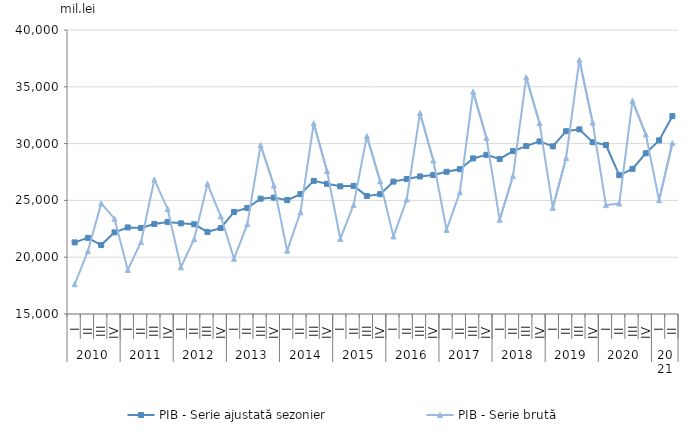
| Category | PIB - Serie ajustată sezonier | PIB - Serie brută |
|---|---|---|
| 0 | 21304.734 | 17618.538 |
| 1 | 21703.866 | 20535.088 |
| 2 | 21067.874 | 24733.989 |
| 3 | 22185.31 | 23387.763 |
| 4 | 22619.5 | 18878.295 |
| 5 | 22574.947 | 21341.813 |
| 6 | 22925.519 | 26828.484 |
| 7 | 23107.692 | 24246.43 |
| 8 | 22981.248 | 19113.189 |
| 9 | 22896.246 | 21579.683 |
| 10 | 22223.198 | 26464.253 |
| 11 | 22566.69 | 23599.498 |
| 12 | 23992.513 | 19867.239 |
| 13 | 24332.297 | 22910.429 |
| 14 | 25152.077 | 29875.092 |
| 15 | 25245.466 | 26311.771 |
| 16 | 25024.693 | 20575.18 |
| 17 | 25548.386 | 23951.428 |
| 18 | 26722.811 | 31790.125 |
| 19 | 26465.746 | 27595.654 |
| 20 | 26240.426 | 21618.259 |
| 21 | 26280.761 | 24596.839 |
| 22 | 25392.562 | 30659.04 |
| 23 | 25547.246 | 26686.781 |
| 24 | 26653.995 | 21830.624 |
| 25 | 26880.469 | 25078.445 |
| 26 | 27109.861 | 32689.956 |
| 27 | 27228.434 | 28527.778 |
| 28 | 27521.08 | 22398.641 |
| 29 | 27744.267 | 25719.356 |
| 30 | 28695.968 | 34566.719 |
| 31 | 29010.252 | 30514.091 |
| 32 | 28648.268 | 23292.847 |
| 33 | 29338.939 | 27146.722 |
| 34 | 29782.348 | 35830.318 |
| 35 | 30192.685 | 31798.143 |
| 36 | 29761.038 | 24344.903 |
| 37 | 31090.309 | 28735.64 |
| 38 | 31253.387 | 37368.572 |
| 39 | 30128.387 | 31846.321 |
| 40 | 29879.169 | 24582.491 |
| 41 | 27219.542 | 24723.055 |
| 42 | 27776.666 | 33764.152 |
| 43 | 29148.872 | 30815.959 |
| 44 | 30283.096 | 25015.77 |
| 45 | 32411.943 | 30045.093 |